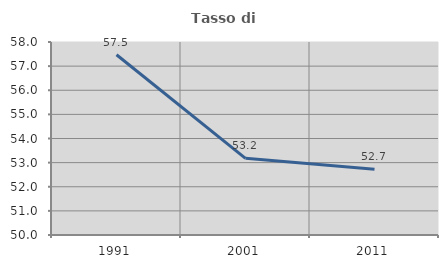
| Category | Tasso di occupazione   |
|---|---|
| 1991.0 | 57.471 |
| 2001.0 | 53.179 |
| 2011.0 | 52.727 |